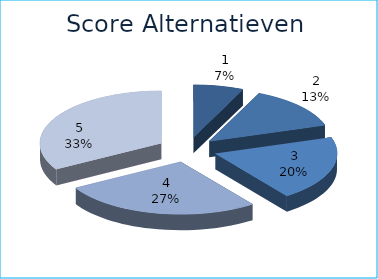
| Category | Series 0 |
|---|---|
| 0 | 6.667 |
| 1 | 13.333 |
| 2 | 20 |
| 3 | 26.667 |
| 4 | 33.333 |